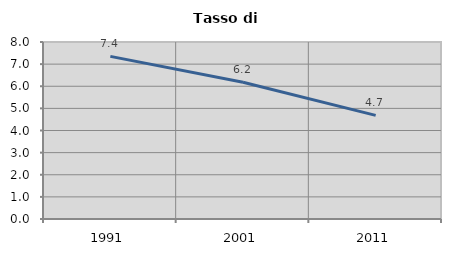
| Category | Tasso di disoccupazione   |
|---|---|
| 1991.0 | 7.35 |
| 2001.0 | 6.181 |
| 2011.0 | 4.684 |